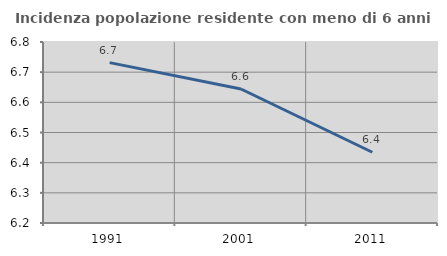
| Category | Incidenza popolazione residente con meno di 6 anni |
|---|---|
| 1991.0 | 6.732 |
| 2001.0 | 6.644 |
| 2011.0 | 6.435 |